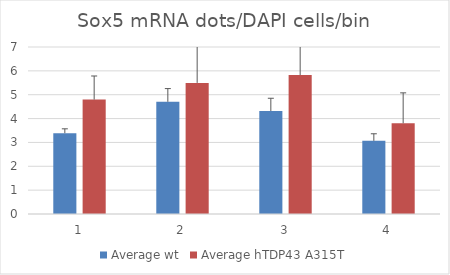
| Category | Average wt | Average hTDP43 A315T |
|---|---|---|
| 0 | 3.387 | 4.796 |
| 1 | 4.703 | 5.495 |
| 2 | 4.317 | 5.824 |
| 3 | 3.066 | 3.803 |